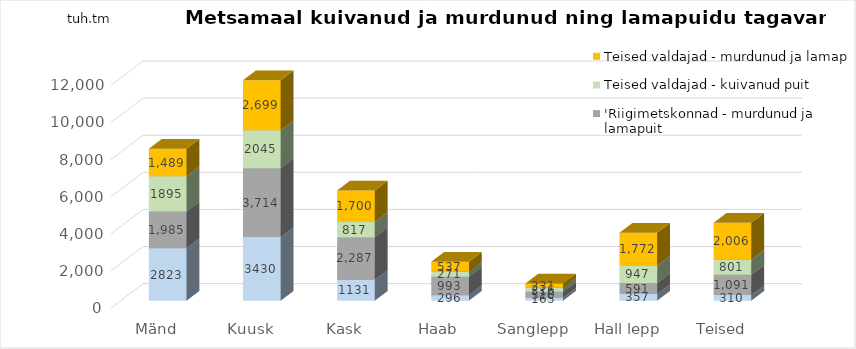
| Category | Riigimetskonnad - kuivanud puit | 'Riigimetskonnad - murdunud ja lamapuit | Teised valdajad - kuivanud puit | Teised valdajad - murdunud ja lamapuit |
|---|---|---|---|---|
| Mänd | 2822.651 | 1985.266 | 1895.147 | 1489.33 |
| Kuusk | 3430.38 | 3713.512 | 2044.743 | 2698.669 |
| Kask | 1130.712 | 2287.028 | 817.464 | 1699.585 |
| Haab | 295.966 | 993.201 | 271.141 | 536.656 |
| Sanglepp | 165.041 | 310.324 | 215.807 | 231.105 |
| Hall lepp | 357.116 | 590.947 | 946.62 | 1772.249 |
| Teised | 309.865 | 1090.735 | 800.951 | 2005.839 |